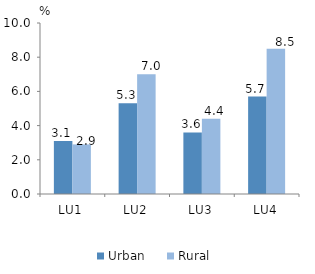
| Category | Urban | Rural |
|---|---|---|
| LU1 | 3.1 | 2.9 |
| LU2 | 5.3 | 7 |
| LU3 | 3.6 | 4.4 |
| LU4 | 5.7 | 8.5 |